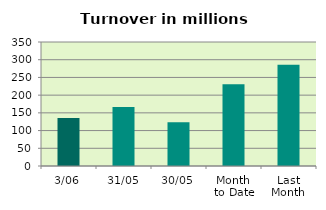
| Category | Series 0 |
|---|---|
| 3/06 | 135.411 |
| 31/05 | 166.254 |
| 30/05 | 123.628 |
| Month 
to Date | 230.433 |
| Last
Month | 285.992 |